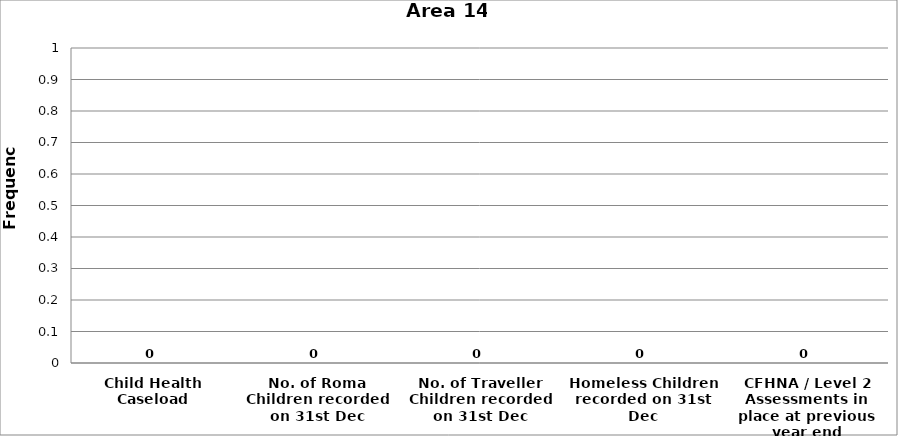
| Category | Area 14 |
|---|---|
| Child Health Caseload | 0 |
| No. of Roma Children recorded on 31st Dec | 0 |
| No. of Traveller Children recorded on 31st Dec | 0 |
| Homeless Children recorded on 31st Dec | 0 |
| CFHNA / Level 2 Assessments in place at previous year end | 0 |